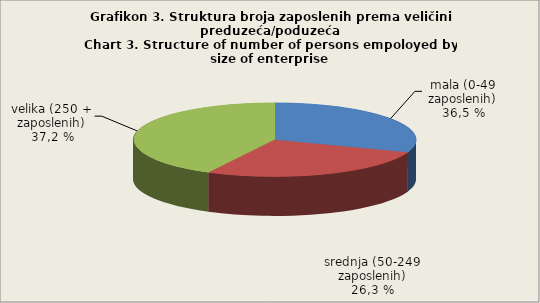
| Category | Broj zaposlenih osoba
Number of persons employed
  |
|---|---|
| mala (0-49 zaposlenih) | 30.6 |
| srednja (50-249 zaposlenih) | 27.1 |
| velika (250 + zaposlenih) | 42.3 |